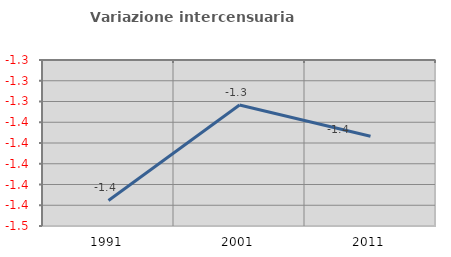
| Category | Variazione intercensuaria annua |
|---|---|
| 1991.0 | -1.435 |
| 2001.0 | -1.343 |
| 2011.0 | -1.373 |